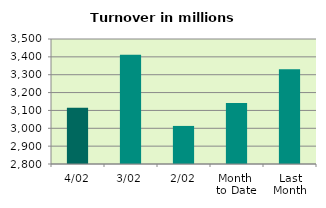
| Category | Series 0 |
|---|---|
| 4/02 | 3115.579 |
| 3/02 | 3411.178 |
| 2/02 | 3013.212 |
| Month 
to Date | 3141.768 |
| Last
Month | 3330.335 |